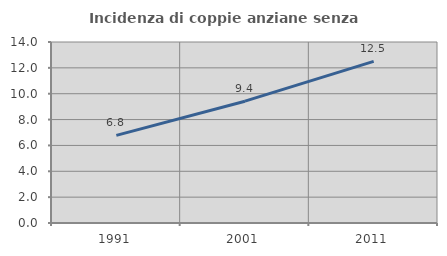
| Category | Incidenza di coppie anziane senza figli  |
|---|---|
| 1991.0 | 6.78 |
| 2001.0 | 9.422 |
| 2011.0 | 12.5 |